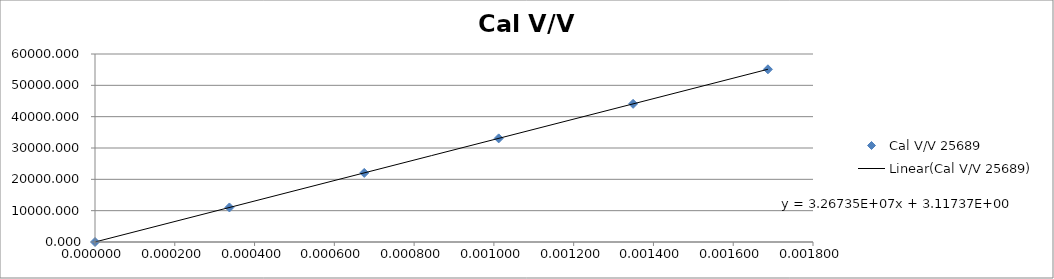
| Category | Cal V/V 25689 |
|---|---|
| 0.0 | 0 |
| 0.000337 | 11023.113 |
| 0.000675 | 22046.226 |
| 0.001012 | 33069.339 |
| 0.001349 | 44092.452 |
| 0.001687 | 55115.566 |